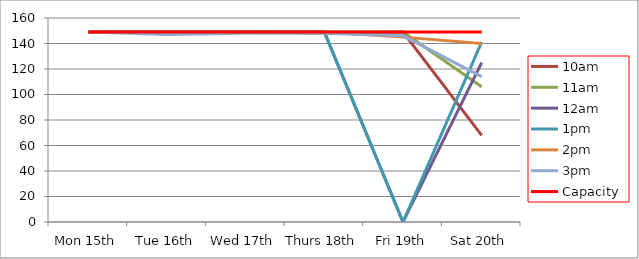
| Category | 9am | 10am | 11am | 12am | 1pm | 2pm | 3pm | 4pm | 5pm | Capacity |
|---|---|---|---|---|---|---|---|---|---|---|
| Mon 15th |  | 149 | 149 | 149 | 149 | 149 | 149 |  |  | 149 |
| Tue 16th |  | 149 | 149 | 149 | 149 | 149 | 147 |  |  | 149 |
| Wed 17th |  | 149 | 149 | 149 | 149 | 149 | 148 |  |  | 149 |
| Thurs 18th |  | 148 | 149 | 149 | 149 | 149 | 148 |  |  | 149 |
| Fri 19th |  | 149 | 149 | 0 | 0 | 145 | 146 |  |  | 149 |
| Sat 20th |  | 68 | 106 | 125 | 141 | 140 | 114 |  |  | 149 |